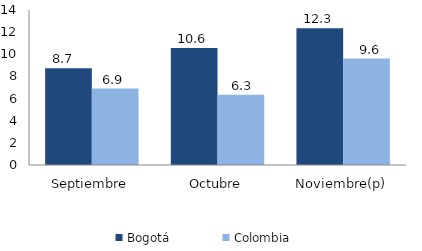
| Category | Bogotá | Colombia |
|---|---|---|
| Septiembre | 8.732 | 6.901 |
| Octubre | 10.557 | 6.341 |
| Noviembre(p) | 12.342 | 9.614 |